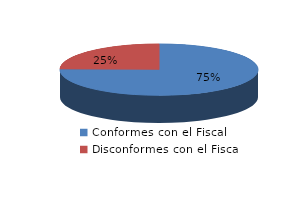
| Category | Series 0 |
|---|---|
| 0 | 1128 |
| 1 | 370 |